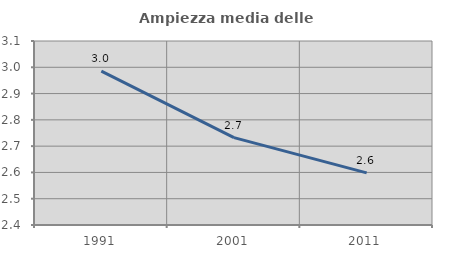
| Category | Ampiezza media delle famiglie |
|---|---|
| 1991.0 | 2.986 |
| 2001.0 | 2.732 |
| 2011.0 | 2.598 |